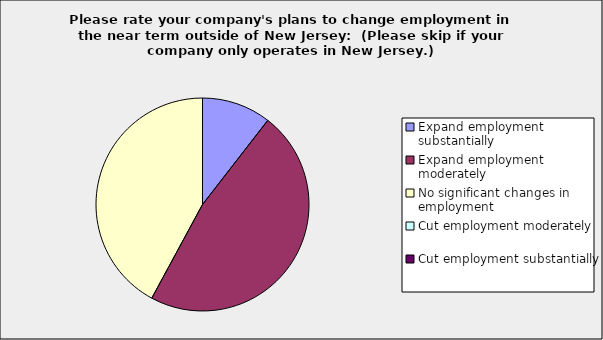
| Category | Series 0 |
|---|---|
| Expand employment substantially | 0.105 |
| Expand employment moderately | 0.474 |
| No significant changes in employment | 0.421 |
| Cut employment moderately | 0 |
| Cut employment substantially | 0 |